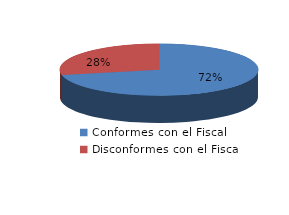
| Category | Series 0 |
|---|---|
| 0 | 775 |
| 1 | 306 |